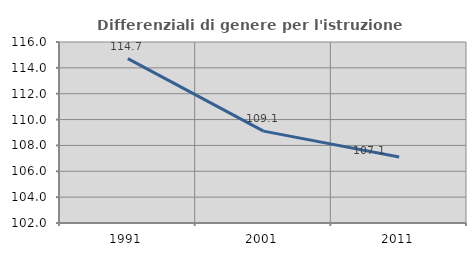
| Category | Differenziali di genere per l'istruzione superiore |
|---|---|
| 1991.0 | 114.713 |
| 2001.0 | 109.105 |
| 2011.0 | 107.099 |